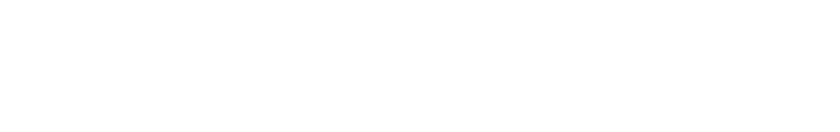
| Category | FINANZIERUNG INSGESAMT | GESAMTAUSGABEN |
|---|---|---|
| 0 | 0 | 0 |